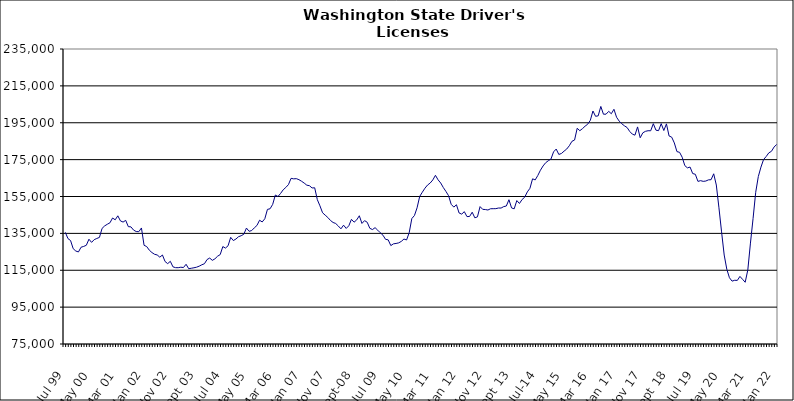
| Category | Series 0 |
|---|---|
| Jul 99 | 135560 |
| Aug 99 | 132182 |
| Sep 99 | 131104 |
| Oct 99 | 126694 |
| Nov 99 | 125425 |
| Dec 99 | 124927 |
| Jan 00 | 127499 |
| Feb 00 | 127927 |
| Mar 00 | 128547 |
| Apr 00 | 131834 |
| May 00 | 130120 |
| Jun 00 | 131595 |
| Jul 00 | 132236 |
| Aug 00 | 132819 |
| Sep 00 | 137711 |
| Oct 00 | 139063 |
| Nov 00 | 139952 |
| Dec 00 | 140732 |
| Jan 01 | 143338 |
| Feb 01 | 142359 |
| Mar 01 | 144523 |
| Apr 01 | 141758 |
| May 01 | 141135 |
| Jun 01 | 142064 |
| Jul 01 | 138646 |
| Aug 01 | 138530 |
| Sep 01 | 136784 |
| Oct 01 | 135996 |
| Nov 01 | 135917 |
| Dec 01 | 137940 |
| Jan 02 | 128531 |
| Feb 02 | 127848 |
| Mar 02 | 125876 |
| Apr 02 | 124595 |
| May 02 | 123660 |
| Jun 02 | 123282 |
| Jul 02 | 122089 |
| Aug 02 | 123279 |
| Sep 02 | 119727 |
| Oct 02 | 118588 |
| Nov 02 | 119854 |
| Dec 02 | 116851 |
| Jan 03 | 116407 |
| Feb 03 | 116382 |
| Mar 03 | 116648 |
| Apr 03 | 116471 |
| May 03 | 118231 |
| Jun 03 | 115831 |
| Jul 03 | 116082 |
| Aug 03 | 116341 |
| Sep 03 | 116653 |
| Oct 03 | 117212 |
| Nov 03 | 117962 |
| Dec 03 | 118542 |
| Jan 04 | 120817 |
| Feb 04 | 121617 |
| Mar 04 | 120369 |
| Apr 04 | 121200 |
| May 04 | 122609 |
| Jun 04 | 123484 |
| Jul 04 | 127844 |
| Aug 04 | 127025 |
| Sep 04 | 128273 |
| Oct 04 | 132853 |
| Nov 04 | 131106 |
| Dec 04 | 131935 |
| Jan 05 | 133205 |
| Feb 05 | 133736 |
| Mar 05 | 134528 |
| Apr 05 | 137889 |
| May 05 | 136130 |
| Jun 05 | 136523 |
| Jul 05 | 137997 |
| Aug 05 | 139294 |
| Sep 05 | 142140 |
| Oct 05 | 141192 |
| Nov 05 | 142937 |
| Dec 05 | 148013 |
| Jan 06 | 148341 |
| Feb 06 | 150744 |
| Mar 06 | 155794 |
| Apr 06 | 154984 |
| May 06 | 156651 |
| Jun 06 | 158638 |
| Jul 06 | 159911 |
| Aug 06 | 161445 |
| Sep 06 | 164852 |
| Oct 06 | 164570 |
| Nov 06 | 164679 |
| Dec 06 | 164127 |
| Jan 07 | 163271 |
| Feb 07 | 162273 |
| Mar 07 | 161140 |
| Apr 07 | 160860 |
| May 07 | 159633 |
| Jun 07 | 159724 |
| Jul 07 | 153303 |
| Aug 07 | 149939 |
| Sep 07 | 146172 |
| Oct 07 | 144876 |
| Nov 07 | 143613 |
| Dec 07 | 142022 |
| Jan 08 | 140909 |
| Feb 08 | 140368 |
| Mar 08 | 138998 |
| Apr 08 | 137471 |
| May 08 | 139453 |
| Jun 08 | 137680 |
| Jul 08 | 139120 |
| Aug 08 | 142612 |
| Sep-08 | 141071 |
| Oct 08 | 142313 |
| Nov 08 | 144556 |
| Dec 08 | 140394 |
| Jan 09 | 141903 |
| Feb 09 | 141036 |
| Mar 09 | 137751 |
| Apr 09 | 137060 |
| May 09 | 138101 |
| Jun 09 | 136739 |
| Jul 09 | 135317 |
| Aug 09 | 134020 |
| Sep 09 | 131756 |
| Oct 09 | 131488 |
| Nov 09 | 128370 |
| Dec 09 | 129323 |
| Jan 10 | 129531 |
| Feb 10 | 129848 |
| Mar 10 | 130654 |
| Apr 10 | 131929 |
| May 10 | 131429 |
| Jun 10 | 135357 |
| Jul 10 | 143032 |
| Aug 10 | 144686 |
| Sep 10 | 148856 |
| Oct 10 | 155042 |
| Nov 10 | 157328 |
| Dec 10 | 159501 |
| Jan 11 | 161221 |
| Feb 11 | 162312 |
| Mar 11 | 163996 |
| Apr 11 | 166495 |
| May 11 | 164040 |
| Jun 11 | 162324 |
| Jul 11 | 159862 |
| Aug 11 | 157738 |
| Sep 11 | 155430 |
| Oct 11 | 150762 |
| Nov 11 | 149255 |
| Dec 11 | 150533 |
| Jan 12 | 146068 |
| Feb 12 | 145446 |
| Mar 12 | 146788 |
| Apr 12 | 144110 |
| May 12 | 144162 |
| Jun 12 | 146482 |
| Jul 12 | 143445 |
| Aug 12 | 143950 |
| Sep 12 | 149520 |
| Oct 12 | 148033 |
| Nov 12 | 147926 |
| Dec 12 | 147674 |
| Jan 13 | 148360 |
| Feb-13 | 148388 |
| Mar-13 | 148414 |
| Apr 13 | 148749 |
| May 13 | 148735 |
| Jun-13 | 149521 |
| Jul 13 | 149837 |
| Aug 13 | 153252 |
| Sep 13 | 148803 |
| Oct 13 | 148315 |
| Nov 13 | 152804 |
| Dec 13 | 151209 |
| Jan 14 | 153357 |
| Feb-14 | 154608 |
| Mar 14 | 157479 |
| Apr 14 | 159441 |
| May 14 | 164591 |
| Jun 14 | 163995 |
| Jul-14 | 166411 |
| Aug-14 | 169272 |
| Sep 14 | 171565 |
| Oct 14 | 173335 |
| Nov 14 | 174406 |
| Dec 14 | 175302 |
| Jan 15 | 179204 |
| Feb 15 | 180737 |
| Mar 15 | 177810 |
| Apr-15 | 178331 |
| May 15 | 179601 |
| Jun-15 | 180729 |
| Jul 15 | 182540 |
| Aug 15 | 184924 |
| Sep 15 | 185620 |
| Oct 15 | 192002 |
| Nov 15 | 190681 |
| Dec 15 | 191795 |
| Jan 16 | 193132 |
| Feb 16 | 194206 |
| Mar 16 | 196319 |
| Apr 16 | 201373 |
| May 16 | 198500 |
| Jun 16 | 198743 |
| Jul 16 | 203841 |
| Aug 16 | 199630 |
| Sep 16 | 199655 |
| Oct 16 | 201181 |
| Nov 16 | 199888 |
| Dec 16 | 202304 |
| Jan 17 | 197977 |
| Feb 17 | 195889 |
| Mar 17 | 194438 |
| Apr 17 | 193335 |
| May 17 | 192430 |
| Jun 17 | 190298 |
| Jul 17 | 188832 |
| Aug 17 | 188264 |
| Sep 17 | 192738 |
| Oct 17 | 186856 |
| Nov 17 | 189537 |
| Dec 17 | 190341 |
| Jan 18 | 190670 |
| Feb 18 | 190645 |
| Mar 18 | 194476 |
| Apr 18 | 190971 |
| May 18 | 190707 |
| Jun 18 | 194516 |
| Jul 18 | 190783 |
| Aug 18 | 194390 |
| Sep 18 | 187831 |
| Oct 18 | 187188 |
| Nov 18 | 184054 |
| Dec 18 | 179347 |
| Jan 19 | 178958 |
| Feb 19 | 176289 |
| Mar 19 | 171747 |
| Apr 19 | 170532 |
| May 19 | 170967 |
| Jun 19 | 167444 |
| Jul 19 | 167059 |
| Aug 19 | 163194 |
| Sep 19 | 163599 |
| Oct 19 | 163212 |
| Nov 19 | 163388 |
| Dec 19 | 164024 |
| Jan 20 | 164114 |
| Feb 20 | 167320 |
| Mar 20 | 161221 |
| Apr 20 | 148866 |
| May 20 | 135821 |
| Jun 20 | 123252 |
| Jul 20 | 115526 |
| Aug 20 | 110940 |
| Sep 20 | 109099 |
| Oct 20 | 109566 |
| Nov 20 | 109488 |
| Dec 20 | 111658 |
| Jan 21 | 110070 |
| Feb 21 | 108491 |
| Mar 21 | 115176 |
| Apr 21 | 129726 |
| May 21 | 143052 |
| Jun 21 | 157253 |
| Jul 21 | 165832 |
| Aug 21 | 170937 |
| Sep 21 | 175042 |
| Oct 21 | 176696 |
| Nov 21 | 178677 |
| Dec 21 | 179501 |
| Jan 22 | 181825 |
| Feb 22 | 183258 |